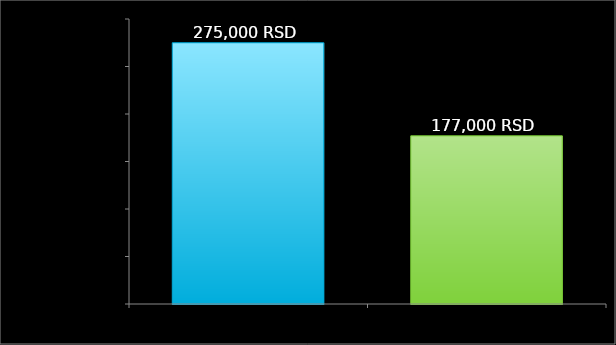
| Category | Series 0 |
|---|---|
| 0 | 275000 |
| 1 | 177000 |